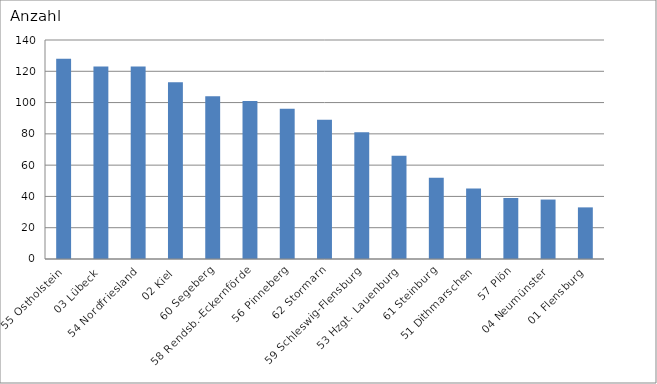
| Category | 55 Ostholstein 03 Lübeck 54 Nordfriesland 02 Kiel 60 Segeberg 58 Rendsb.-Eckernförde 56 Pinneberg 62 Stormarn 59 Schleswig-Flensburg 53 Hzgt. Lauenburg 61 Steinburg 51 Dithmarschen 57 Plön 04 Neumünster 01 Flensburg |
|---|---|
| 55 Ostholstein | 128 |
| 03 Lübeck | 123 |
| 54 Nordfriesland | 123 |
| 02 Kiel | 113 |
| 60 Segeberg | 104 |
| 58 Rendsb.-Eckernförde | 101 |
| 56 Pinneberg | 96 |
| 62 Stormarn | 89 |
| 59 Schleswig-Flensburg | 81 |
| 53 Hzgt. Lauenburg | 66 |
| 61 Steinburg | 52 |
| 51 Dithmarschen | 45 |
| 57 Plön | 39 |
| 04 Neumünster | 38 |
| 01 Flensburg | 33 |